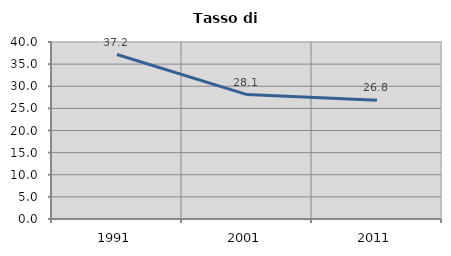
| Category | Tasso di disoccupazione   |
|---|---|
| 1991.0 | 37.166 |
| 2001.0 | 28.12 |
| 2011.0 | 26.842 |